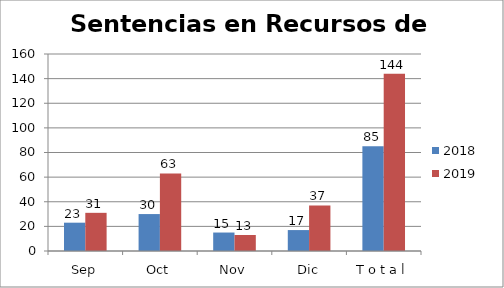
| Category | 2018 | 2019 |
|---|---|---|
| Sep | 23 | 31 |
| Oct | 30 | 63 |
| Nov | 15 | 13 |
| Dic | 17 | 37 |
| T o t a l | 85 | 144 |